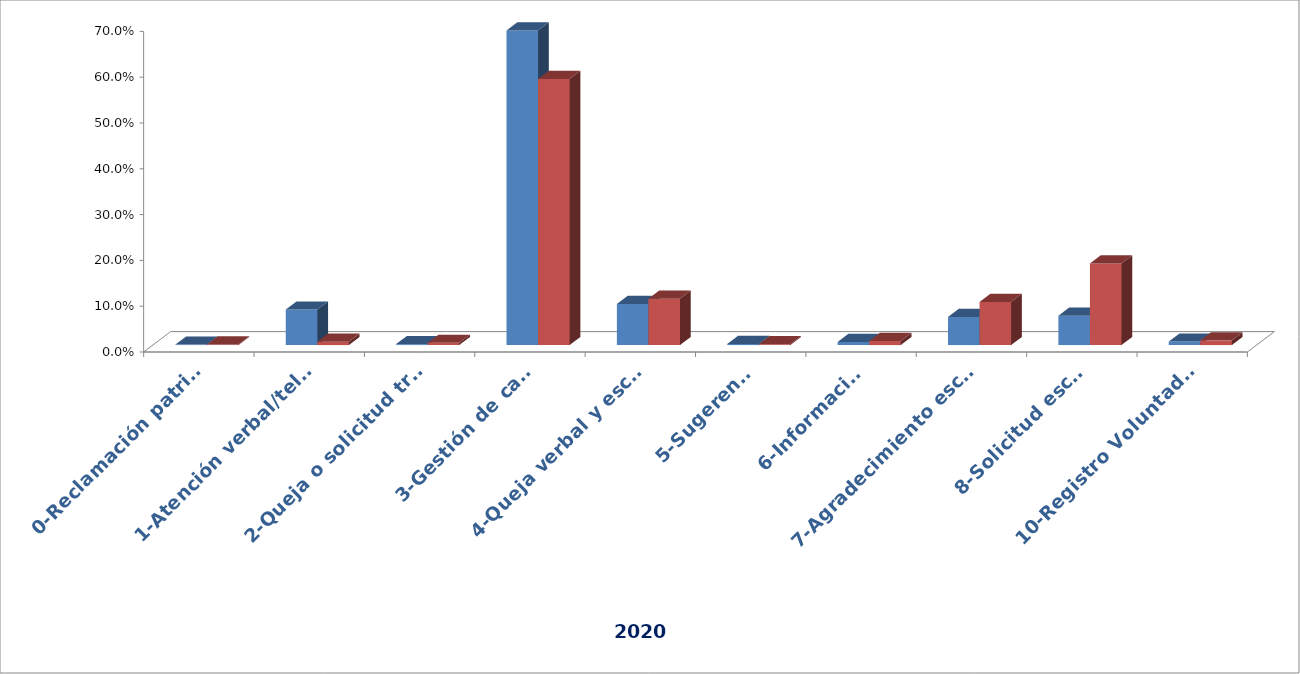
| Category | Series 0 | Series 1 |
|---|---|---|
| 0-Reclamación patrimonial | 0.001 | 0.001 |
| 1-Atención verbal/telefónica | 0.078 | 0.007 |
| 2-Queja o solicitud tramitada a otro departamento | 0.002 | 0.005 |
| 3-Gestión de casos | 0.687 | 0.581 |
| 4-Queja verbal y escrita | 0.09 | 0.101 |
| 5-Sugerencia | 0.003 | 0.002 |
| 6-Información | 0.007 | 0.009 |
| 7-Agradecimiento escrito | 0.061 | 0.094 |
| 8-Solicitud escrita | 0.064 | 0.178 |
| 10-Registro Voluntades Anticipadas | 0.008 | 0.01 |